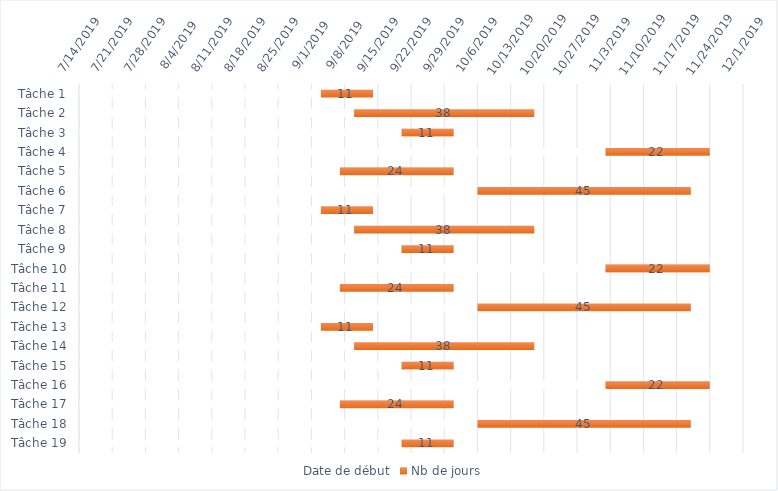
| Category | Date de début | Nb de jours |
|---|---|---|
| Tâche 1 | 2019-09-03 | 11 |
| Tâche 2 | 2019-09-10 | 38 |
| Tâche 3 | 2019-09-20 | 11 |
| Tâche 4 | 2019-11-02 | 22 |
| Tâche 5 | 2019-09-07 | 24 |
| Tâche 6 | 2019-10-06 | 45 |
| Tâche 7 | 2019-09-03 | 11 |
| Tâche 8 | 2019-09-10 | 38 |
| Tâche 9 | 2019-09-20 | 11 |
| Tâche 10 | 2019-11-02 | 22 |
| Tâche 11 | 2019-09-07 | 24 |
| Tâche 12 | 2019-10-06 | 45 |
| Tâche 13 | 2019-09-03 | 11 |
| Tâche 14 | 2019-09-10 | 38 |
| Tâche 15 | 2019-09-20 | 11 |
| Tâche 16 | 2019-11-02 | 22 |
| Tâche 17 | 2019-09-07 | 24 |
| Tâche 18 | 2019-10-06 | 45 |
| Tâche 19 | 2019-09-20 | 11 |